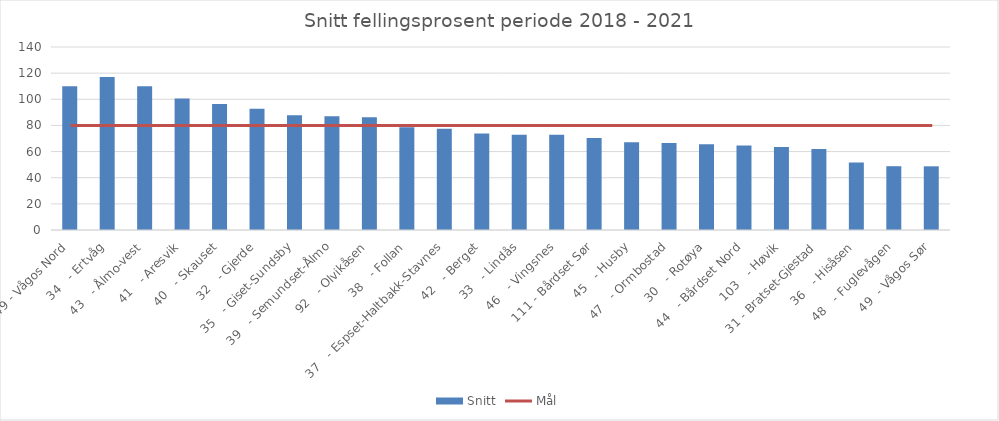
| Category | Snitt |
|---|---|
| 49 - Vågos Nord | 110.05 |
| 34   - Ertvåg | 117.05 |
| 43   - Ålmo-vest | 110 |
| 41   - Aresvik | 100.6 |
| 40   - Skauset | 96.325 |
| 32   - Gjerde | 92.85 |
| 35   - Giset-Sundsby | 87.85 |
| 39   - Semundset-Ålmo | 87.025 |
| 92   - Olvikåsen | 86.25 |
| 38   - Follan | 78.65 |
| 37   - Espset-Haltbakk-Stavnes | 77.55 |
| 42   - Berget | 73.9 |
| 33   - Lindås | 72.925 |
| 46   - Vingsnes | 72.775 |
| 111 - Bårdset Sør | 70.35 |
| 45   - Husby | 67.2 |
| 47   - Ormbostad | 66.525 |
| 30   - Rotøya | 65.6 |
| 44   - Bårdset Nord | 64.575 |
| 103   - Høvik | 63.5 |
| 31 - Bratset-Gjestad | 61.95 |
| 36   - Hisåsen | 51.675 |
| 48   - Fuglevågen | 48.8 |
| 49  - Vågos Sør | 48.725 |